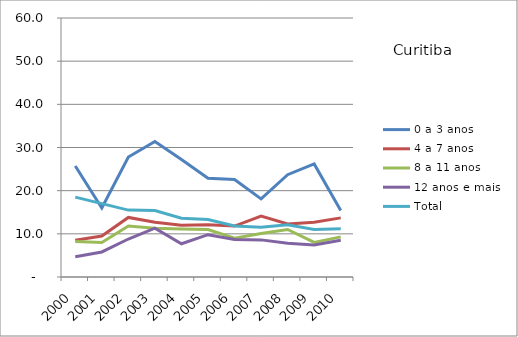
| Category | 0 a 3 anos | 4 a 7 anos | 8 a 11 anos | 12 anos e mais | Total |
|---|---|---|---|---|---|
| 2000.0 | 25.7 | 8.5 | 8.2 | 4.7 | 18.5 |
| 2001.0 | 16 | 9.5 | 8 | 5.8 | 17 |
| 2002.0 | 27.8 | 13.8 | 11.8 | 8.8 | 15.5 |
| 2003.0 | 31.4 | 12.7 | 11.3 | 11.3 | 15.4 |
| 2004.0 | 27.2 | 12 | 11.1 | 7.7 | 13.6 |
| 2005.0 | 22.9 | 12.1 | 11 | 9.8 | 13.3 |
| 2006.0 | 22.6 | 11.8 | 9 | 8.7 | 11.8 |
| 2007.0 | 18.1 | 14.1 | 10.1 | 8.6 | 11.5 |
| 2008.0 | 23.7 | 12.3 | 11 | 7.8 | 12.1 |
| 2009.0 | 26.2 | 12.7 | 8 | 7.4 | 11 |
| 2010.0 | 15.4 | 13.7 | 9.3 | 8.5 | 11.2 |